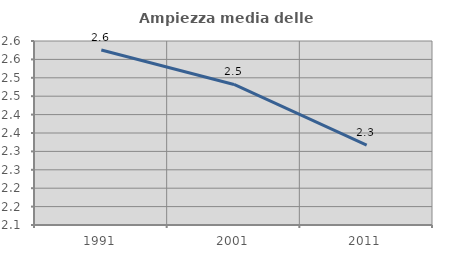
| Category | Ampiezza media delle famiglie |
|---|---|
| 1991.0 | 2.575 |
| 2001.0 | 2.482 |
| 2011.0 | 2.317 |